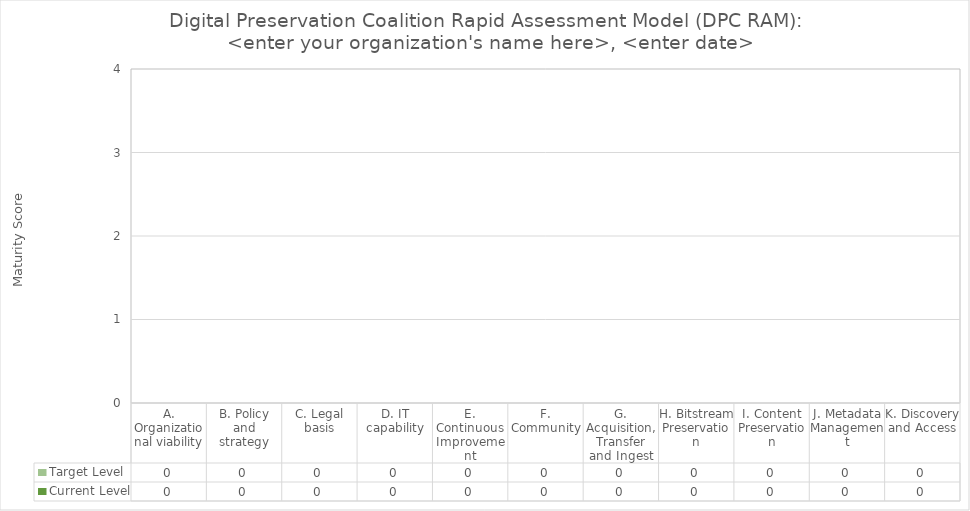
| Category | Target Level | Current Level |
|---|---|---|
| A. Organizational viability | 0 | 0 |
| B. Policy and strategy | 0 | 0 |
| C. Legal basis | 0 | 0 |
| D. IT capability | 0 | 0 |
| E. Continuous Improvement | 0 | 0 |
| F. Community | 0 | 0 |
| G. Acquisition, Transfer and Ingest | 0 | 0 |
| H. Bitstream Preservation | 0 | 0 |
| I. Content Preservation | 0 | 0 |
| J. Metadata Management | 0 | 0 |
| K. Discovery and Access | 0 | 0 |